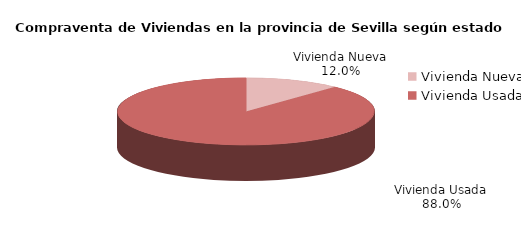
| Category | Series 0 | Series 1 |
|---|---|---|
| Vivienda Nueva | 182 | 0.12 |
| Vivienda Usada | 1331 | 0.88 |